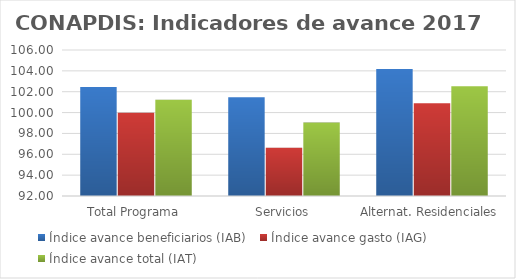
| Category | Índice avance beneficiarios (IAB)  | Índice avance gasto (IAG) | Índice avance total (IAT)  |
|---|---|---|---|
| Total Programa | 102.455 | 99.986 | 101.22 |
| Servicios | 101.471 | 96.622 | 99.046 |
| Alternat. Residenciales | 104.17 | 100.897 | 102.533 |